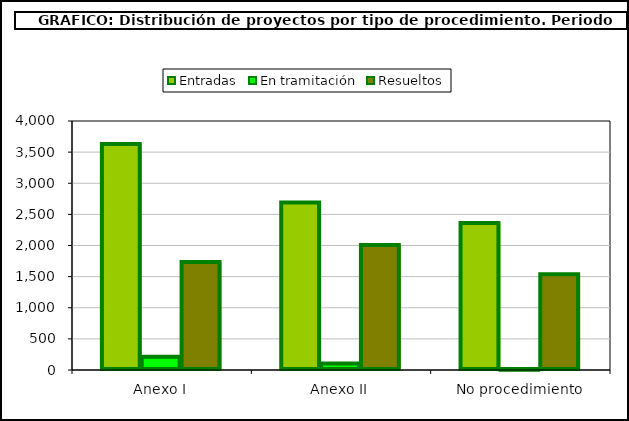
| Category | Entradas | En tramitación | Resueltos |
|---|---|---|---|
| Anexo I | 3629 | 211 | 1733 |
| Anexo II | 2690 | 105 | 2009 |
| No procedimiento | 2361 | 6 | 1537 |